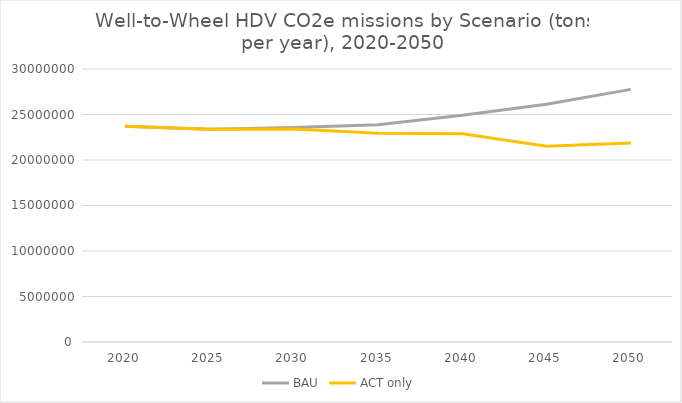
| Category | BAU | ACT only |
|---|---|---|
| 2020.0 | 23715675.587 | 23715675.587 |
| 2025.0 | 23370675.642 | 23370675.642 |
| 2030.0 | 23563861.529 | 23400976.781 |
| 2035.0 | 23879779.868 | 22928182.25 |
| 2040.0 | 24924134.106 | 22885222.932 |
| 2045.0 | 26129606.844 | 21522112.824 |
| 2050.0 | 27759421.593 | 21872059.794 |